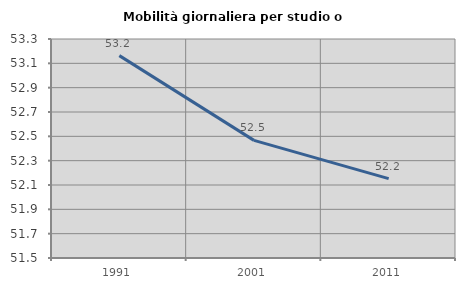
| Category | Mobilità giornaliera per studio o lavoro |
|---|---|
| 1991.0 | 53.163 |
| 2001.0 | 52.467 |
| 2011.0 | 52.152 |